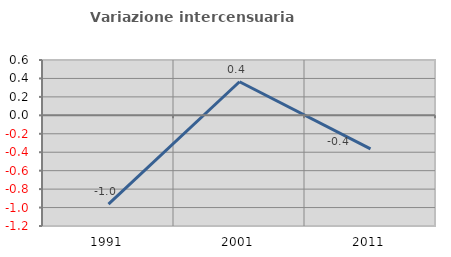
| Category | Variazione intercensuaria annua |
|---|---|
| 1991.0 | -0.963 |
| 2001.0 | 0.364 |
| 2011.0 | -0.363 |